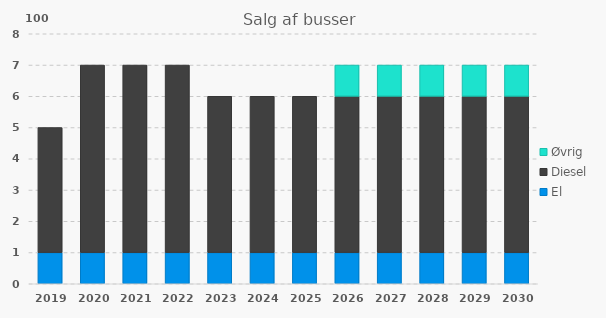
| Category | El | Diesel | Øvrig |
|---|---|---|---|
| 2019 | 1 | 4 | 0 |
| 2020 | 1 | 6 | 0 |
| 2021 | 1 | 6 | 0 |
| 2022 | 1 | 6 | 0 |
| 2023 | 1 | 5 | 0 |
| 2024 | 1 | 5 | 0 |
| 2025 | 1 | 5 | 0 |
| 2026 | 1 | 5 | 1 |
| 2027 | 1 | 5 | 1 |
| 2028 | 1 | 5 | 1 |
| 2029 | 1 | 5 | 1 |
| 2030 | 1 | 5 | 1 |